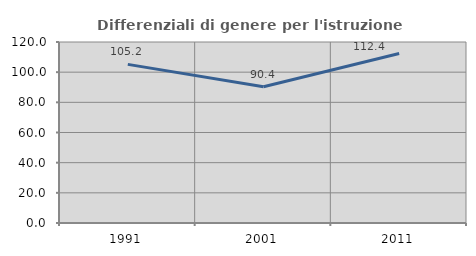
| Category | Differenziali di genere per l'istruzione superiore |
|---|---|
| 1991.0 | 105.178 |
| 2001.0 | 90.374 |
| 2011.0 | 112.394 |